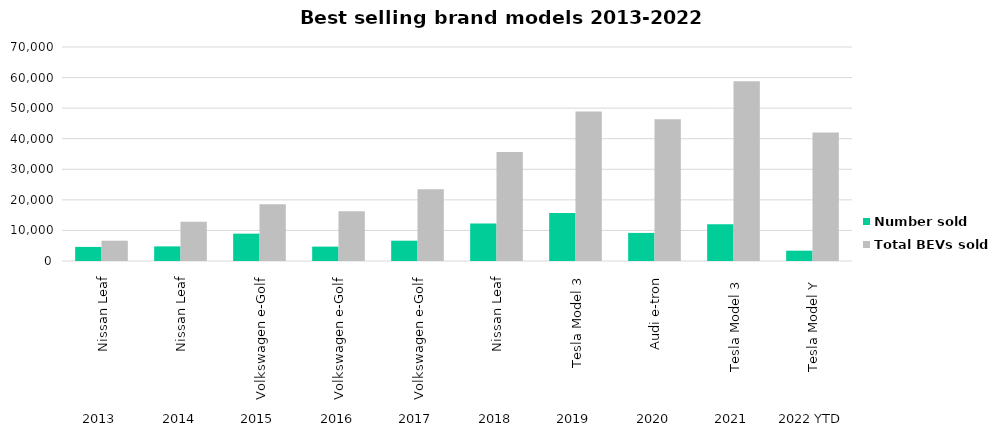
| Category | Number sold  | Total BEVs sold  |
|---|---|---|
| 0 | 4604 | 6638 |
| 1 | 4781 | 12878 |
| 2 | 8943 | 18539 |
| 3 | 4705 | 16291 |
| 4 | 6639 | 23508 |
| 5 | 12303 | 35685 |
| 6 | 15683 | 48892 |
| 7 | 9184 | 46348 |
| 8 | 12058 | 58819 |
| 9 | 3373 | 42067 |